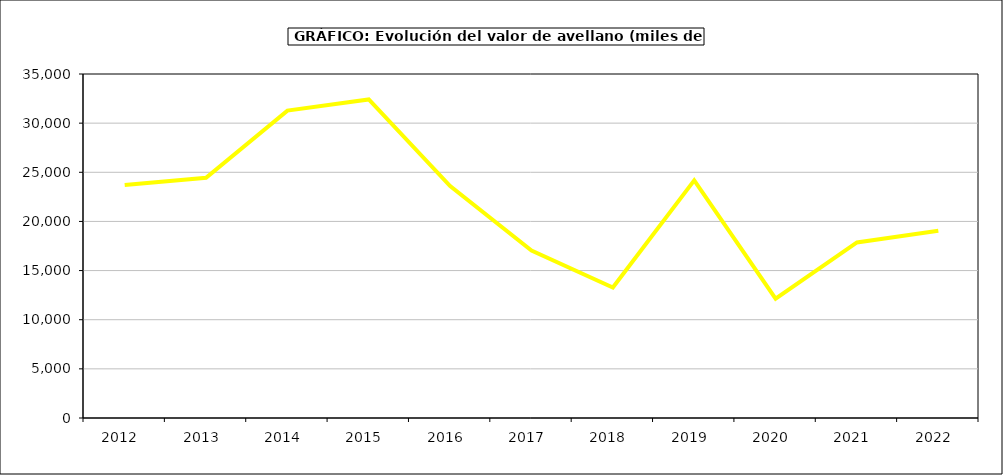
| Category | valor avellano |
|---|---|
| 2012.0 | 23700.751 |
| 2013.0 | 24448.005 |
| 2014.0 | 31273.096 |
| 2015.0 | 32413 |
| 2016.0 | 23592 |
| 2017.0 | 17033.361 |
| 2018.0 | 13279.352 |
| 2019.0 | 24182.831 |
| 2020.0 | 12143.344 |
| 2021.0 | 17860.781 |
| 2022.0 | 19041.977 |